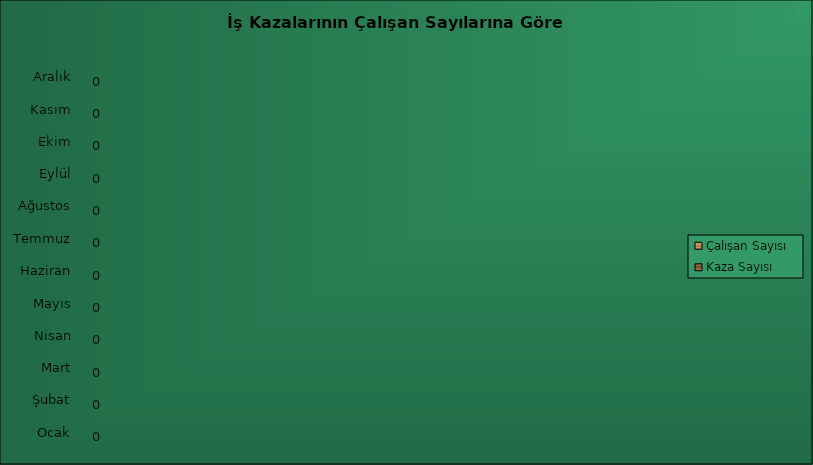
| Category | Kaza Sayısı | Çalışan Sayısı |
|---|---|---|
| Ocak | 0 |  |
| Şubat | 0 |  |
| Mart | 0 |  |
| Nisan | 0 |  |
| Mayıs | 0 |  |
| Haziran | 0 |  |
| Temmuz | 0 |  |
| Ağustos | 0 |  |
| Eylül | 0 |  |
| Ekim | 0 |  |
| Kasım | 0 |  |
| Aralık | 0 |  |